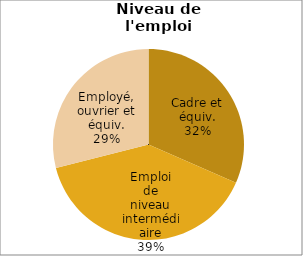
| Category | Promotion 2007 |
|---|---|
| Cadre et équiv. | 0.316 |
| Emploi de niveau intermédiaire | 0.395 |
| Employé, ouvrier et équiv. | 0.289 |